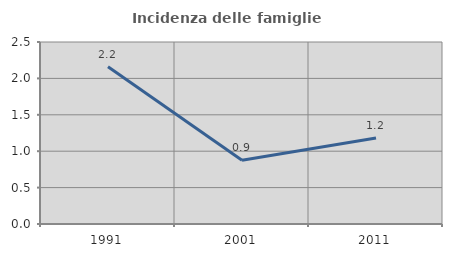
| Category | Incidenza delle famiglie numerose |
|---|---|
| 1991.0 | 2.16 |
| 2001.0 | 0.876 |
| 2011.0 | 1.18 |